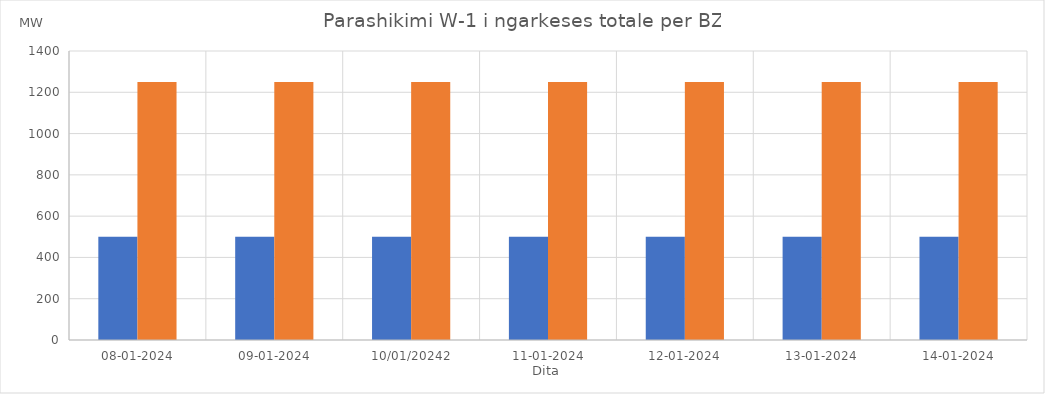
| Category | Min (MW) | Max (MW) |
|---|---|---|
| 08-01-2024 | 500 | 1250 |
| 09-01-2024 | 500 | 1250 |
| 10/01/20242 | 500 | 1250 |
| 11-01-2024 | 500 | 1250 |
| 12-01-2024 | 500 | 1250 |
| 13-01-2024 | 500 | 1250 |
| 14-01-2024 | 500 | 1250 |